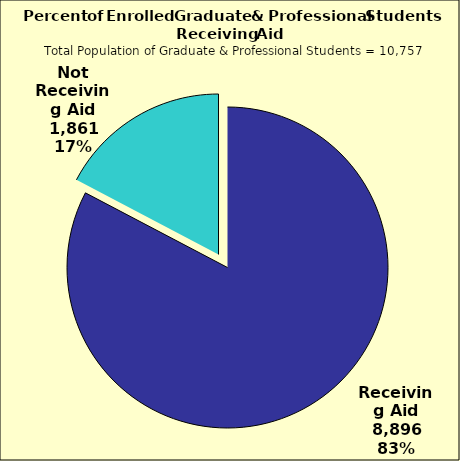
| Category | Series 0 |
|---|---|
| Receiving Aid | 8896 |
| Not Receiving Aid | 1861 |